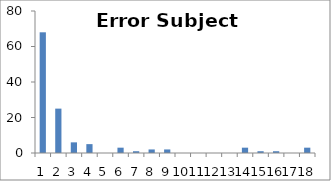
| Category | Sub4 |
|---|---|
| 0 | 68 |
| 1 | 25 |
| 2 | 6 |
| 3 | 5 |
| 4 | 0 |
| 5 | 3 |
| 6 | 1 |
| 7 | 2 |
| 8 | 2 |
| 9 | 0 |
| 10 | 0 |
| 11 | 0 |
| 12 | 0 |
| 13 | 3 |
| 14 | 1 |
| 15 | 1 |
| 16 | 0 |
| 17 | 3 |